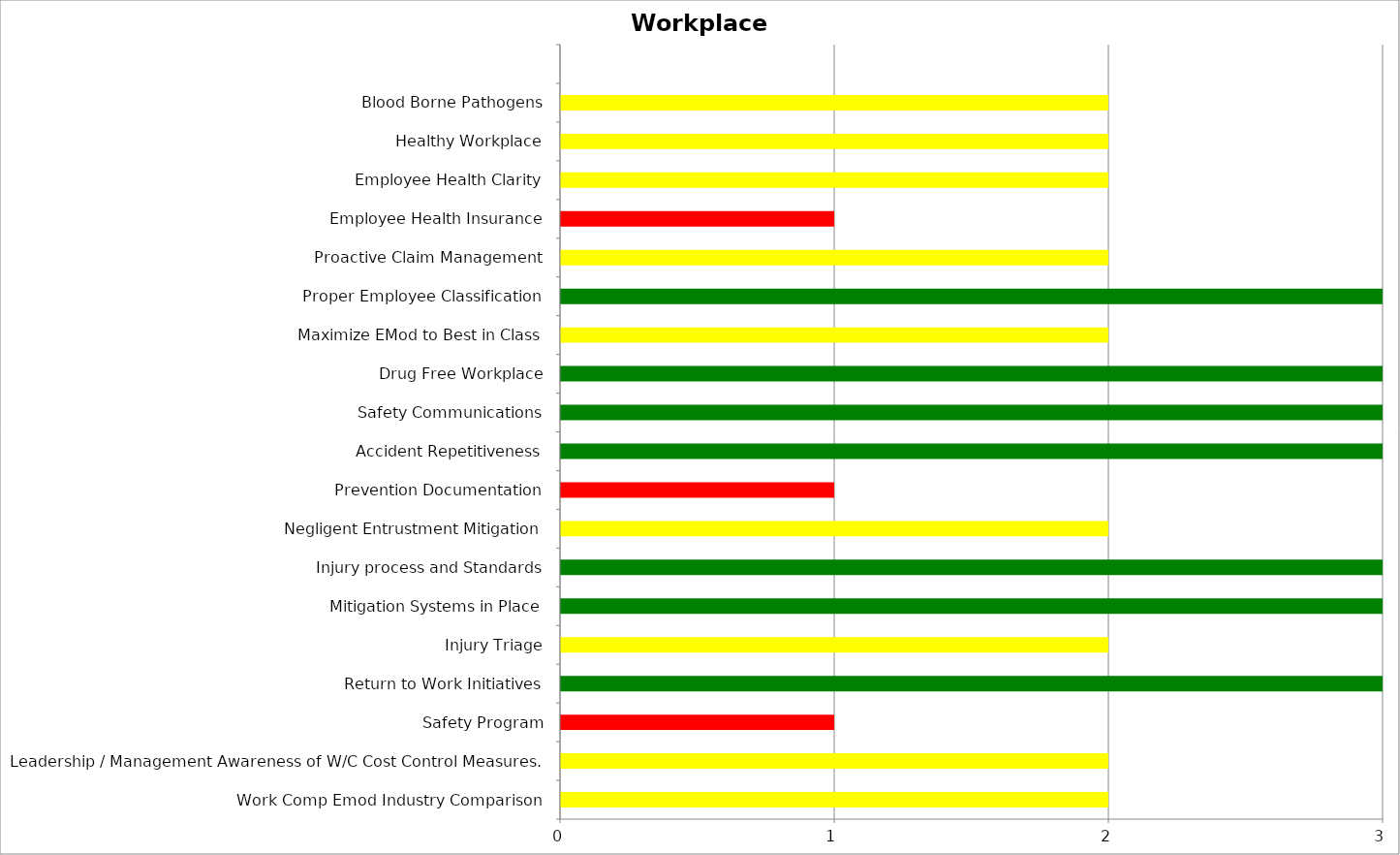
| Category | Low | Medium | High |
|---|---|---|---|
| Work Comp Emod Industry Comparison | 0 | 2 | 0 |
| Leadership / Management Awareness of W/C Cost Control Measures. | 0 | 2 | 0 |
| Safety Program | 0 | 0 | 1 |
| Return to Work Initiatives | 3 | 0 | 0 |
| Injury Triage | 0 | 2 | 0 |
| Mitigation Systems in Place | 3 | 0 | 0 |
| Injury process and Standards | 3 | 0 | 0 |
| Negligent Entrustment Mitigation | 0 | 2 | 0 |
| Prevention Documentation | 0 | 0 | 1 |
| Accident Repetitiveness | 3 | 0 | 0 |
| Safety Communications | 3 | 0 | 0 |
| Drug Free Workplace | 3 | 0 | 0 |
| Maximize EMod to Best in Class | 0 | 2 | 0 |
| Proper Employee Classification | 3 | 0 | 0 |
| Proactive Claim Management | 0 | 2 | 0 |
| Employee Health Insurance | 0 | 0 | 1 |
| Employee Health Clarity | 0 | 2 | 0 |
| Healthy Workplace | 0 | 2 | 0 |
| Blood Borne Pathogens | 0 | 2 | 0 |